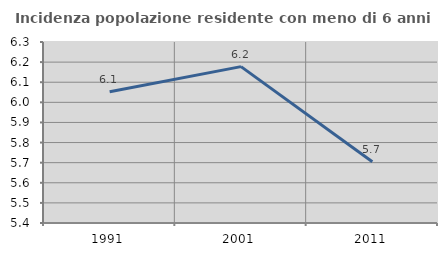
| Category | Incidenza popolazione residente con meno di 6 anni |
|---|---|
| 1991.0 | 6.052 |
| 2001.0 | 6.178 |
| 2011.0 | 5.705 |